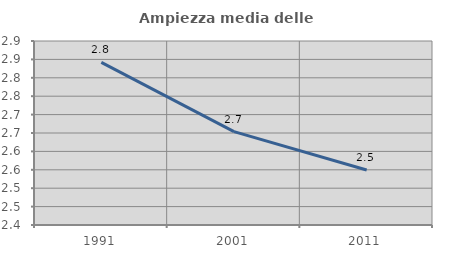
| Category | Ampiezza media delle famiglie |
|---|---|
| 1991.0 | 2.842 |
| 2001.0 | 2.654 |
| 2011.0 | 2.549 |